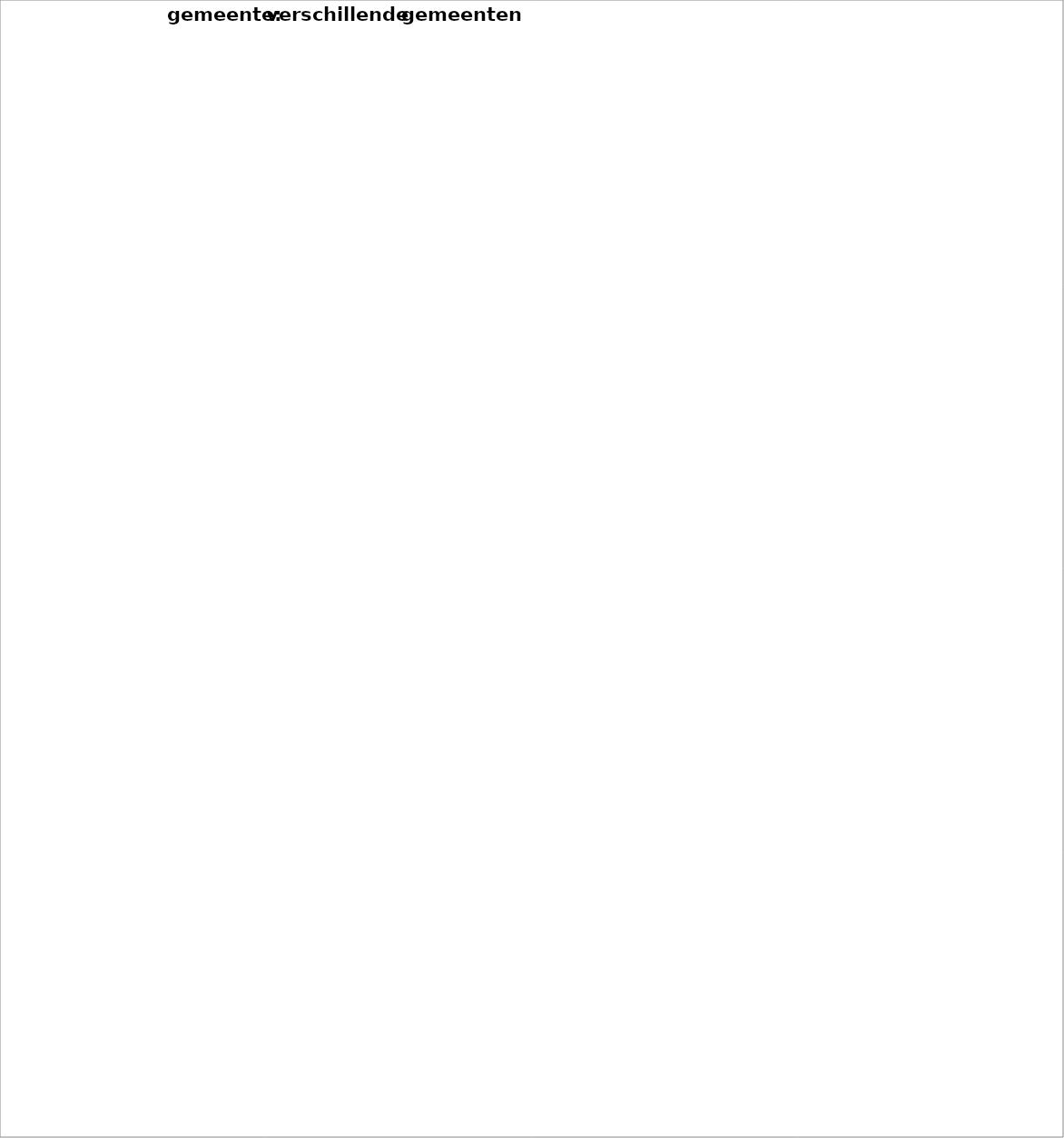
| Category | Totaal |
|---|---|
| Dhaene | -3 |
| Byttebier (/Francois Matthys(Mimotex)) | -3 |
| Furniere | -3 |
| Ververij | -2 |
| Destoop | -2 |
| Balcaen/Delrue invest | -2 |
| cima-nutrition | -1 |
| Vennootschap Frolan | -1 |
| Weedries | 0 |
| Venn De Kleine Prins - Werner Saelens | 0 |
| Reynaert | 0 |
| onderneming | 0 |
| Steverlynck | 0 |
| stationsomgeving | 1 |
| Vanhoutte | 1 |
| BBC | 1 |
| Venn. PVD | 1 |
| Pyromedia | 2 |
| Venn. Uniproject | 3 |
| Venn. Leie Invest - Lafaut Investment | 3 |
| BKCP Bank | 3 |
| Vennootschap Heirweg  | 3 |
| Huis + magazijn Venn. Deroo | 4 |
| Venn. Beaupre | 4 |
| Ruïne - deel van RUP Blekerij | 4 |
| Draaisma en Desmet | 4 |
| Stadseigendom (SOK?) | 4 |
| Thomas Goethals Advocaat | 4 |